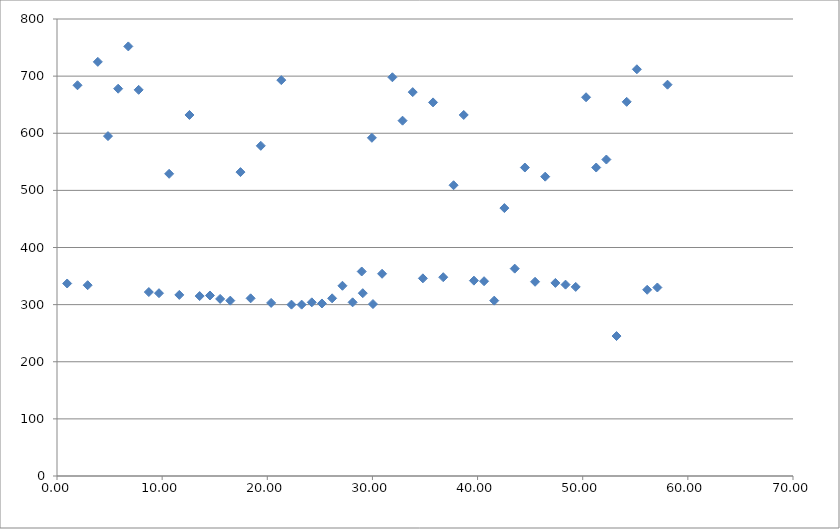
| Category | Series 0 |
|---|---|
| 0.9666666666666667 | 337 |
| 1.95 | 684 |
| 2.9166666666666665 | 334 |
| 3.8833333333333333 | 725 |
| 4.85 | 595 |
| 5.816666666666666 | 678 |
| 6.783333333333333 | 752 |
| 7.766666666666667 | 676 |
| 8.733333333333333 | 322 |
| 9.7 | 320 |
| 10.666666666666666 | 529 |
| 11.633333333333333 | 317 |
| 12.6 | 632 |
| 13.566666666666666 | 315 |
| 14.55 | 316 |
| 15.516666666666667 | 310 |
| 16.483333333333334 | 307 |
| 17.45 | 532 |
| 18.416666666666668 | 311 |
| 19.383333333333333 | 578 |
| 20.366666666666667 | 303 |
| 21.333333333333332 | 693 |
| 22.3 | 300 |
| 23.266666666666666 | 300 |
| 24.233333333333334 | 304 |
| 25.2 | 302 |
| 26.166666666666668 | 311 |
| 27.15 | 333 |
| 28.116666666666667 | 304 |
| 29.083333333333332 | 320 |
| 30.05 | 301 |
| 28.983333333333334 | 358 |
| 29.95 | 592 |
| 30.916666666666668 | 354 |
| 31.9 | 698 |
| 32.86666666666667 | 622 |
| 33.833333333333336 | 672 |
| 34.8 | 346 |
| 35.766666666666666 | 654 |
| 36.733333333333334 | 348 |
| 37.71666666666667 | 509 |
| 38.68333333333333 | 632 |
| 39.65 | 342 |
| 40.61666666666667 | 341 |
| 41.583333333333336 | 307 |
| 42.55 | 469 |
| 43.53333333333333 | 363 |
| 44.5 | 540 |
| 45.46666666666667 | 340 |
| 46.43333333333333 | 524 |
| 47.4 | 338 |
| 48.36666666666667 | 335 |
| 49.333333333333336 | 331 |
| 50.31666666666667 | 663 |
| 51.28333333333333 | 540 |
| 52.25 | 554 |
| 53.21666666666667 | 245 |
| 54.18333333333333 | 655 |
| 55.15 | 712 |
| 56.13333333333333 | 326 |
| 57.1 | 330 |
| 58.06666666666667 | 685 |